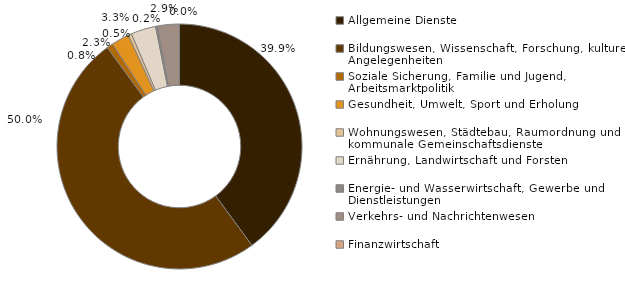
| Category | Series 0 |
|---|---|
| Allgemeine Dienste | 22685 |
| Bildungswesen, Wissenschaft, Forschung, kulturelle Angelegenheiten | 28415 |
| Soziale Sicherung, Familie und Jugend, Arbeitsmarktpolitik | 465 |
| Gesundheit, Umwelt, Sport und Erholung | 1330 |
| Wohnungswesen, Städtebau, Raumordnung und kommunale Gemeinschaftsdienste | 260 |
| Ernährung, Landwirtschaft und Forsten | 1865 |
| Energie- und Wasserwirtschaft, Gewerbe und Dienstleistungen | 135 |
| Verkehrs- und Nachrichtenwesen | 1630 |
| Finanzwirtschaft | 10 |